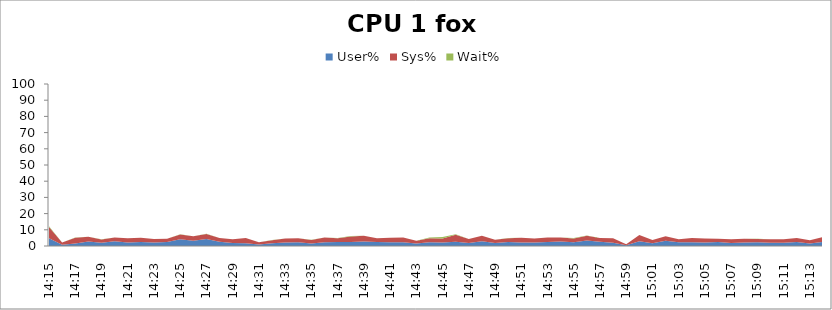
| Category | User% | Sys% | Wait% |
|---|---|---|---|
| 14:15 | 4.8 | 7 | 0.4 |
| 14:16 | 0.8 | 1.4 | 0 |
| 14:17 | 1.5 | 3.6 | 0.1 |
| 14:18 | 2.8 | 2.9 | 0 |
| 14:19 | 2 | 2 | 0.1 |
| 14:20 | 3 | 2.3 | 0 |
| 14:21 | 2.2 | 2.6 | 0 |
| 14:22 | 2.4 | 2.7 | 0 |
| 14:23 | 2.1 | 2.2 | 0 |
| 14:24 | 2.4 | 2 | 0 |
| 14:25 | 4.2 | 2.9 | 0.2 |
| 14:26 | 3.2 | 2.8 | 0 |
| 14:27 | 4.3 | 3.1 | 0.1 |
| 14:28 | 2.6 | 2.3 | 0 |
| 14:29 | 1.8 | 2.3 | 0.1 |
| 14:30 | 1.7 | 3.3 | 0 |
| 14:31 | 1 | 1.3 | 0 |
| 14:32 | 1.7 | 1.9 | 0.1 |
| 14:33 | 2.1 | 2.6 | 0 |
| 14:34 | 2.3 | 2.5 | 0 |
| 14:35 | 1.6 | 2.1 | 0.1 |
| 14:36 | 2.3 | 3 | 0 |
| 14:37 | 2.5 | 2.3 | 0.1 |
| 14:38 | 2.4 | 3.5 | 0.2 |
| 14:39 | 2.8 | 3.5 | 0.1 |
| 14:40 | 2.5 | 2.3 | 0 |
| 14:41 | 2.3 | 2.8 | 0 |
| 14:42 | 2.3 | 2.9 | 0 |
| 14:43 | 1.5 | 1.7 | 0.1 |
| 14:44 | 2.3 | 2.5 | 0.4 |
| 14:45 | 2.2 | 2.5 | 0.8 |
| 14:46 | 2.7 | 4.3 | 0.3 |
| 14:47 | 1.9 | 2.4 | 0 |
| 14:48 | 2.9 | 3.4 | 0 |
| 14:49 | 1.9 | 2 | 0 |
| 14:50 | 2.4 | 2.4 | 0.1 |
| 14:51 | 2.2 | 2.9 | 0 |
| 14:52 | 2.1 | 2.5 | 0 |
| 14:53 | 2.4 | 2.9 | 0 |
| 14:54 | 2.8 | 2.4 | 0 |
| 14:55 | 2.3 | 2.4 | 0.2 |
| 14:56 | 3.4 | 3 | 0.1 |
| 14:57 | 2.6 | 2.4 | 0 |
| 14:58 | 2 | 2.8 | 0 |
| 14:59 | 0.4 | 0.7 | 0 |
| 15:00 | 3 | 3.8 | 0 |
| 15:01 | 1.7 | 2 | 0 |
| 15:02 | 3.3 | 2.7 | 0 |
| 15:03 | 2.3 | 1.9 | 0 |
| 15:04 | 2.3 | 2.7 | 0 |
| 15:05 | 2.1 | 2.6 | 0 |
| 15:06 | 2.4 | 2 | 0 |
| 15:07 | 1.8 | 2.4 | 0 |
| 15:08 | 2.2 | 2.2 | 0.1 |
| 15:09 | 2.3 | 2 | 0.1 |
| 15:10 | 2 | 2.1 | 0.1 |
| 15:11 | 2 | 2.2 | 0 |
| 15:12 | 2.5 | 2.5 | 0 |
| 15:13 | 1.6 | 1.9 | 0 |
| 15:14 | 2.6 | 3 | 0 |